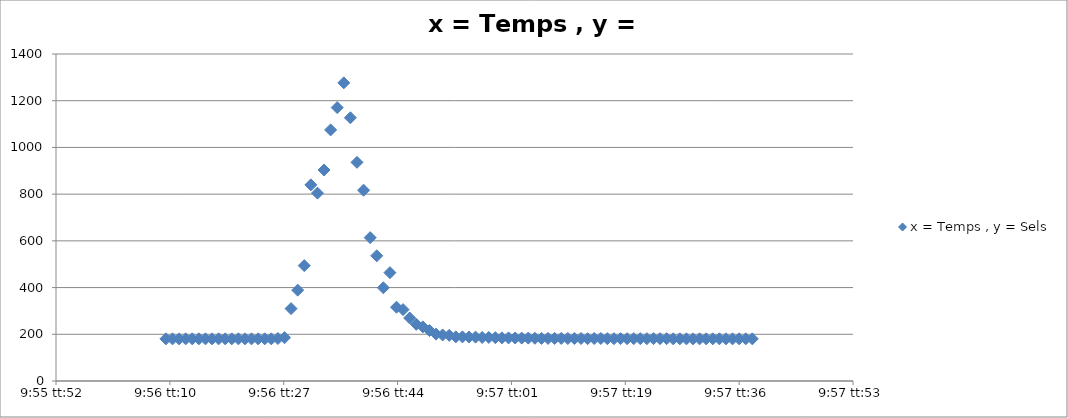
| Category | x = Temps , y = Sels |
|---|---|
| 0.41399305555555554 | 180.471 |
| 0.41400462962962964 | 180.471 |
| 0.4140162037037037 | 180.471 |
| 0.41402777777777783 | 180.529 |
| 0.41403935185185187 | 180.529 |
| 0.41405092592592596 | 180.529 |
| 0.4140625 | 180.529 |
| 0.41407407407407404 | 180.588 |
| 0.41408564814814813 | 180.471 |
| 0.41409722222222217 | 180.471 |
| 0.4141087962962963 | 180.471 |
| 0.41412037037037036 | 180.471 |
| 0.41413194444444446 | 180.529 |
| 0.4141435185185185 | 180.529 |
| 0.4141550925925926 | 180.529 |
| 0.4141666666666666 | 180.588 |
| 0.4141782407407408 | 180.529 |
| 0.4141898148148148 | 181.941 |
| 0.4142013888888889 | 185.412 |
| 0.41421296296296295 | 309.941 |
| 0.41422453703703704 | 388.824 |
| 0.4142361111111111 | 494.059 |
| 0.41424768518518523 | 839.647 |
| 0.41425925925925927 | 804.412 |
| 0.41427083333333337 | 903.235 |
| 0.4142824074074074 | 1075.118 |
| 0.4142939814814815 | 1170.588 |
| 0.41430555555555554 | 1276.471 |
| 0.4143171296296296 | 1127 |
| 0.4143287037037037 | 936.176 |
| 0.41434027777777777 | 816.882 |
| 0.41435185185185186 | 613.706 |
| 0.4143634259259259 | 536.176 |
| 0.414375 | 399.235 |
| 0.41438657407407403 | 463.824 |
| 0.4143981481481482 | 315.882 |
| 0.4144097222222222 | 305.588 |
| 0.4144212962962963 | 269.765 |
| 0.41443287037037035 | 242.647 |
| 0.41444444444444445 | 231.647 |
| 0.4144560185185185 | 215.941 |
| 0.41446759259259264 | 200.706 |
| 0.4144791666666667 | 197.235 |
| 0.41449074074074077 | 195.529 |
| 0.4145023148148148 | 189 |
| 0.4145138888888889 | 188.941 |
| 0.41452546296296294 | 188.235 |
| 0.414537037037037 | 187.882 |
| 0.41454861111111113 | 186.471 |
| 0.41456018518518517 | 186.471 |
| 0.41457175925925926 | 185.412 |
| 0.4145833333333333 | 184.647 |
| 0.4145949074074074 | 184.353 |
| 0.41460648148148144 | 184.353 |
| 0.4146180555555556 | 183.647 |
| 0.4146296296296296 | 183.647 |
| 0.4146412037037037 | 183 |
| 0.41465277777777776 | 182.353 |
| 0.41466435185185185 | 182.353 |
| 0.4146759259259259 | 182.294 |
| 0.41468750000000004 | 182.294 |
| 0.4146990740740741 | 182 |
| 0.4147106481481482 | 181.941 |
| 0.4147222222222222 | 181.941 |
| 0.4147337962962963 | 181.235 |
| 0.41474537037037035 | 182 |
| 0.4147569444444445 | 182 |
| 0.41476851851851854 | 181.235 |
| 0.4147800925925926 | 181.235 |
| 0.41479166666666667 | 181.235 |
| 0.4148032407407407 | 181.235 |
| 0.4148148148148148 | 181.235 |
| 0.41482638888888884 | 181.235 |
| 0.414837962962963 | 181.235 |
| 0.41484953703703703 | 181.235 |
| 0.4148611111111111 | 181.235 |
| 0.41487268518518516 | 181.235 |
| 0.41488425925925926 | 180.529 |
| 0.4148958333333333 | 180.529 |
| 0.41490740740740745 | 180.529 |
| 0.4149189814814815 | 180.471 |
| 0.4149305555555556 | 180.529 |
| 0.4149421296296296 | 180.529 |
| 0.4149537037037037 | 180.529 |
| 0.41496527777777775 | 180.588 |
| 0.4149768518518519 | 180.529 |
| 0.41498842592592594 | 180.529 |
| 0.41500000000000004 | 180.588 |
| 0.4150115740740741 | 180.588 |
| 0.4150231481481481 | 180.529 |